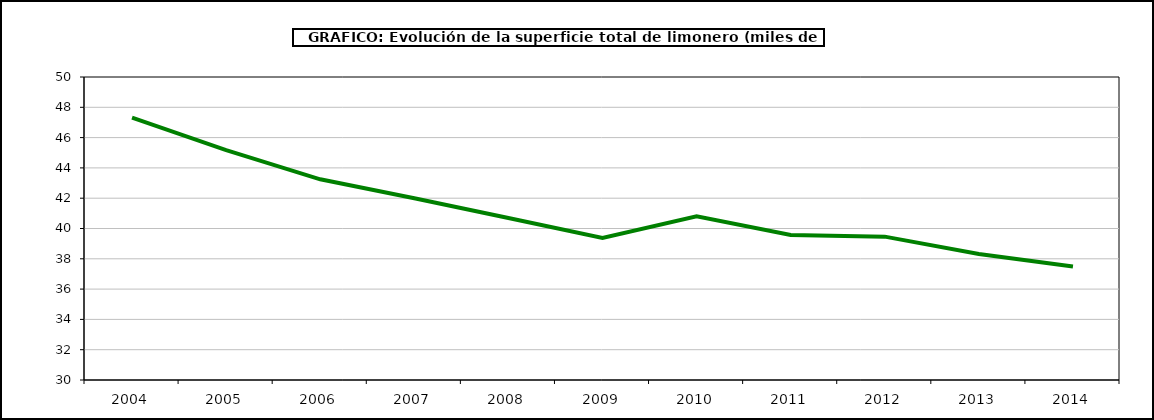
| Category | superficie |
|---|---|
| 2004.0 | 47.313 |
| 2005.0 | 45.171 |
| 2006.0 | 43.247 |
| 2007.0 | 41.996 |
| 2008.0 | 40.689 |
| 2009.0 | 39.371 |
| 2010.0 | 40.801 |
| 2011.0 | 39.571 |
| 2012.0 | 39.463 |
| 2013.0 | 38.319 |
| 2014.0 | 37.498 |